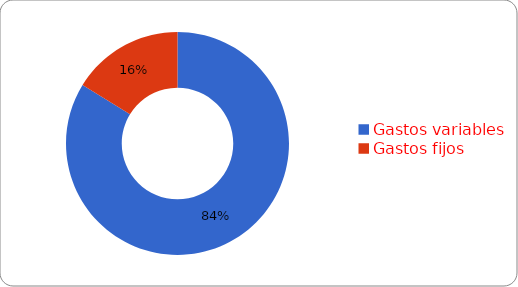
| Category | Series 0 |
|---|---|
| Gastos variables | 310 |
| Gastos fijos | 60 |